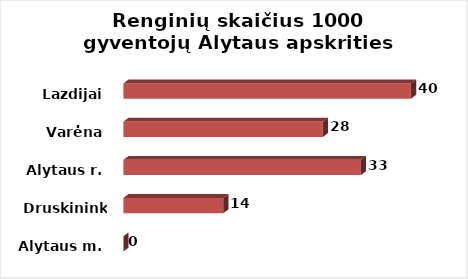
| Category | Series 0 |
|---|---|
| Alytaus m. | 0 |
| Druskininkai | 14.015 |
| Alytaus r. | 33.34 |
| Varėna | 28.018 |
| Lazdijai | 40.384 |